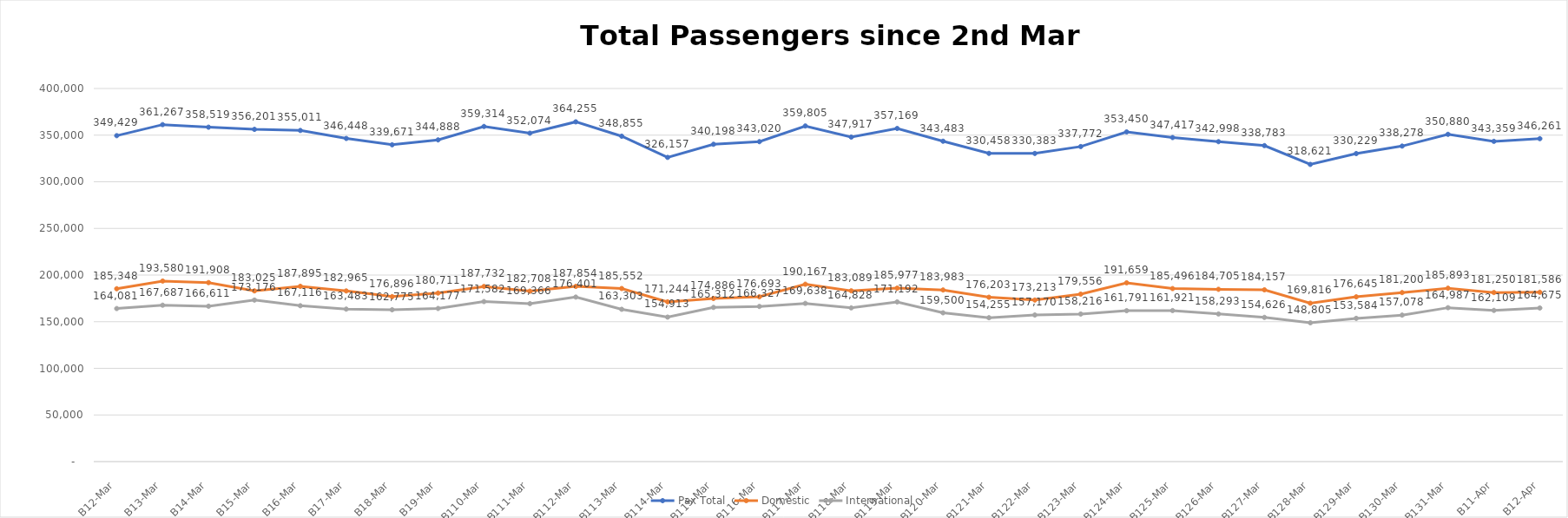
| Category | Pax Total |  Domestic  |  International  |
|---|---|---|---|
| 2023-03-02 | 349429 | 185348 | 164081 |
| 2023-03-03 | 361267 | 193580 | 167687 |
| 2023-03-04 | 358519 | 191908 | 166611 |
| 2023-03-05 | 356201 | 183025 | 173176 |
| 2023-03-06 | 355011 | 187895 | 167116 |
| 2023-03-07 | 346448 | 182965 | 163483 |
| 2023-03-08 | 339671 | 176896 | 162775 |
| 2023-03-09 | 344888 | 180711 | 164177 |
| 2023-03-10 | 359314 | 187732 | 171582 |
| 2023-03-11 | 352074 | 182708 | 169366 |
| 2023-03-12 | 364255 | 187854 | 176401 |
| 2023-03-13 | 348855 | 185552 | 163303 |
| 2023-03-14 | 326157 | 171244 | 154913 |
| 2023-03-15 | 340198 | 174886 | 165312 |
| 2023-03-16 | 343020 | 176693 | 166327 |
| 2023-03-17 | 359805 | 190167 | 169638 |
| 2023-03-18 | 347917 | 183089 | 164828 |
| 2023-03-19 | 357169 | 185977 | 171192 |
| 2023-03-20 | 343483 | 183983 | 159500 |
| 2023-03-21 | 330458 | 176203 | 154255 |
| 2023-03-22 | 330383 | 173213 | 157170 |
| 2023-03-23 | 337772 | 179556 | 158216 |
| 2023-03-24 | 353450 | 191659 | 161791 |
| 2023-03-25 | 347417 | 185496 | 161921 |
| 2023-03-26 | 342998 | 184705 | 158293 |
| 2023-03-27 | 338783 | 184157 | 154626 |
| 2023-03-28 | 318621 | 169816 | 148805 |
| 2023-03-29 | 330229 | 176645 | 153584 |
| 2023-03-30 | 338278 | 181200 | 157078 |
| 2023-03-31 | 350880 | 185893 | 164987 |
| 2023-04-01 | 343359 | 181250 | 162109 |
| 2023-04-02 | 346261 | 181586 | 164675 |